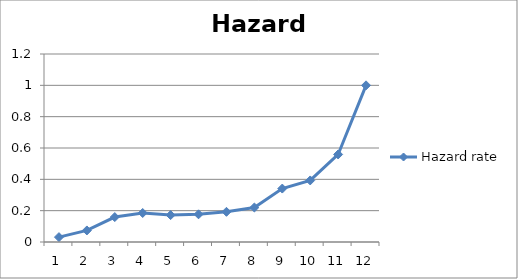
| Category | Hazard rate |
|---|---|
| 0 | 0.031 |
| 1 | 0.074 |
| 2 | 0.159 |
| 3 | 0.185 |
| 4 | 0.172 |
| 5 | 0.177 |
| 6 | 0.193 |
| 7 | 0.22 |
| 8 | 0.341 |
| 9 | 0.393 |
| 10 | 0.559 |
| 11 | 1 |